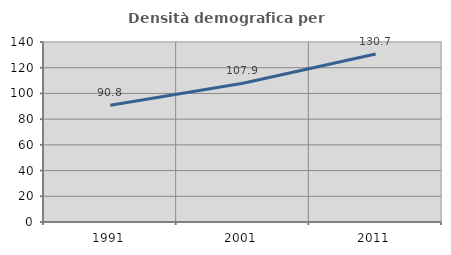
| Category | Densità demografica |
|---|---|
| 1991.0 | 90.816 |
| 2001.0 | 107.928 |
| 2011.0 | 130.652 |